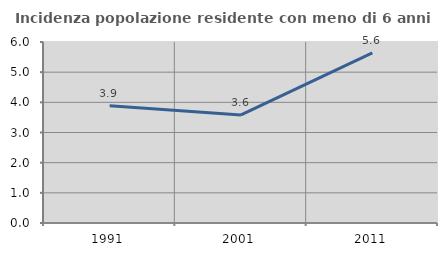
| Category | Incidenza popolazione residente con meno di 6 anni |
|---|---|
| 1991.0 | 3.89 |
| 2001.0 | 3.583 |
| 2011.0 | 5.637 |